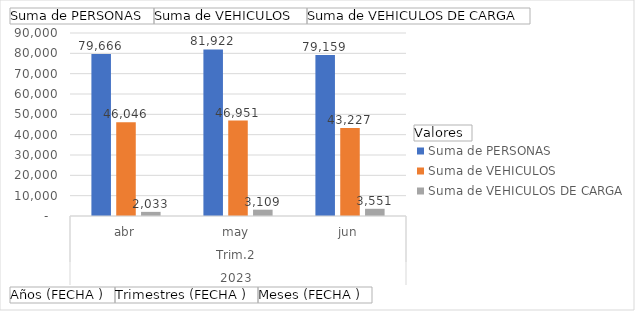
| Category | Suma de PERSONAS | Suma de VEHICULOS  | Suma de VEHICULOS DE CARGA |
|---|---|---|---|
| 0 | 79666 | 46046 | 2033 |
| 1 | 81922 | 46951 | 3109 |
| 2 | 79159 | 43227 | 3551 |